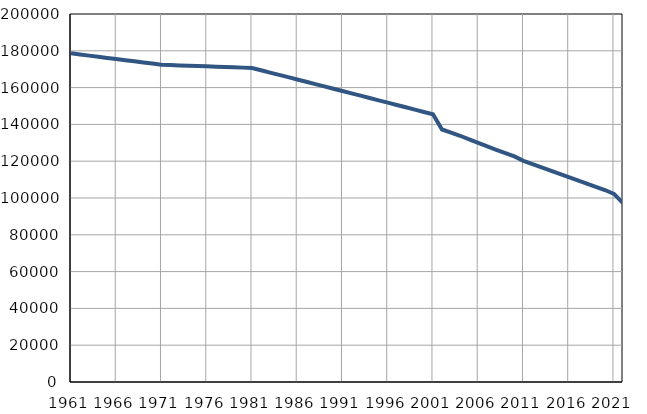
| Category | Број
становника |
|---|---|
| 1961.0 | 178623 |
| 1962.0 | 178003 |
| 1963.0 | 177383 |
| 1964.0 | 176763 |
| 1965.0 | 176143 |
| 1966.0 | 175524 |
| 1967.0 | 174904 |
| 1968.0 | 174284 |
| 1969.0 | 173664 |
| 1970.0 | 173044 |
| 1971.0 | 172424 |
| 1972.0 | 172250 |
| 1973.0 | 172076 |
| 1974.0 | 171901 |
| 1975.0 | 171727 |
| 1976.0 | 171553 |
| 1977.0 | 171379 |
| 1978.0 | 171205 |
| 1979.0 | 171030 |
| 1980.0 | 170856 |
| 1981.0 | 170682 |
| 1982.0 | 169427 |
| 1983.0 | 168172 |
| 1984.0 | 166917 |
| 1985.0 | 165662 |
| 1986.0 | 164407 |
| 1987.0 | 163151 |
| 1988.0 | 161896 |
| 1989.0 | 160641 |
| 1990.0 | 159386 |
| 1991.0 | 158131 |
| 1992.0 | 156869 |
| 1993.0 | 155606 |
| 1994.0 | 154344 |
| 1995.0 | 153082 |
| 1996.0 | 151819 |
| 1997.0 | 150557 |
| 1998.0 | 149294 |
| 1999.0 | 148032 |
| 2000.0 | 146770 |
| 2001.0 | 145508 |
| 2002.0 | 137218 |
| 2003.0 | 135553 |
| 2004.0 | 133825 |
| 2005.0 | 131896 |
| 2006.0 | 129937 |
| 2007.0 | 128056 |
| 2008.0 | 126217 |
| 2009.0 | 124423 |
| 2010.0 | 122605 |
| 2011.0 | 120216 |
| 2012.0 | 118401 |
| 2013.0 | 116665 |
| 2014.0 | 114901 |
| 2015.0 | 113131 |
| 2016.0 | 111399 |
| 2017.0 | 109634 |
| 2018.0 | 107835 |
| 2019.0 | 106100 |
| 2020.0 | 104352 |
| 2021.0 | 102215 |
| 2022.0 | 97220 |